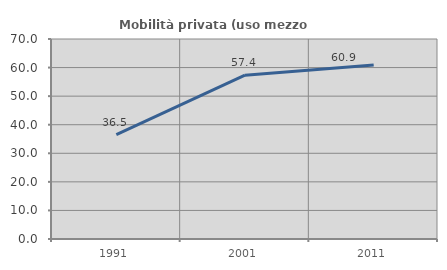
| Category | Mobilità privata (uso mezzo privato) |
|---|---|
| 1991.0 | 36.538 |
| 2001.0 | 57.353 |
| 2011.0 | 60.909 |